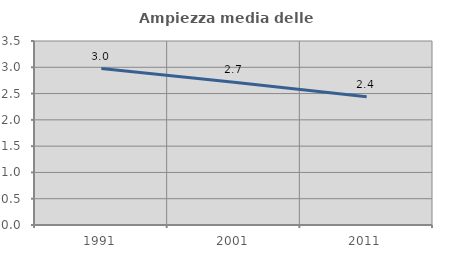
| Category | Ampiezza media delle famiglie |
|---|---|
| 1991.0 | 2.976 |
| 2001.0 | 2.715 |
| 2011.0 | 2.442 |